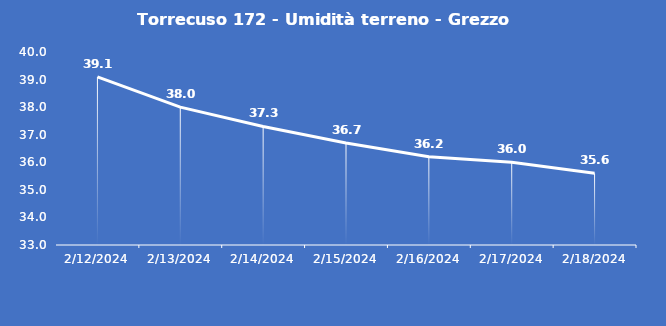
| Category | Torrecuso 172 - Umidità terreno - Grezzo (%VWC) |
|---|---|
| 2/12/24 | 39.1 |
| 2/13/24 | 38 |
| 2/14/24 | 37.3 |
| 2/15/24 | 36.7 |
| 2/16/24 | 36.2 |
| 2/17/24 | 36 |
| 2/18/24 | 35.6 |